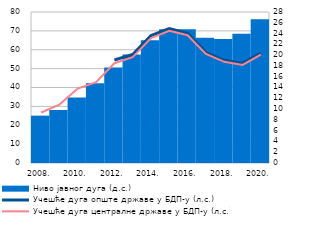
| Category | Ниво јавног дуга (д.с.) |
|---|---|
| 2008. | 8.781 |
| 2009. | 9.849 |
| 2010. | 12.157 |
| 2011. | 14.784 |
| 2012. | 17.717 |
| 2013. | 20.141 |
| 2014. | 22.757 |
| 2015. | 24.801 |
| 2016. | 24.822 |
| 2017. | 23.221 |
| 2018. | 23.015 |
| 2019. | 23.944 |
| 2020. | 26.669 |